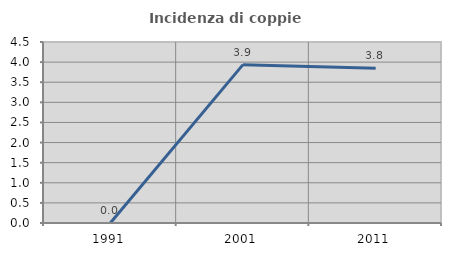
| Category | Incidenza di coppie miste |
|---|---|
| 1991.0 | 0 |
| 2001.0 | 3.937 |
| 2011.0 | 3.846 |